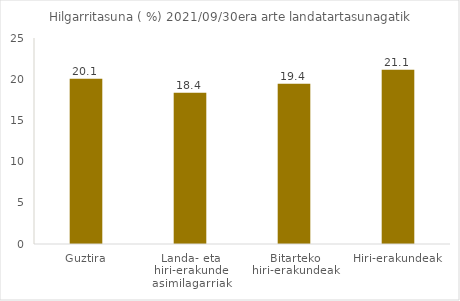
| Category | Series 0 |
|---|---|
| Guztira | 20.055 |
| Landa- eta hiri-erakunde asimilagarriak
 | 18.351 |
| Bitarteko hiri-erakundeak | 19.436 |
| Hiri-erakundeak | 21.141 |